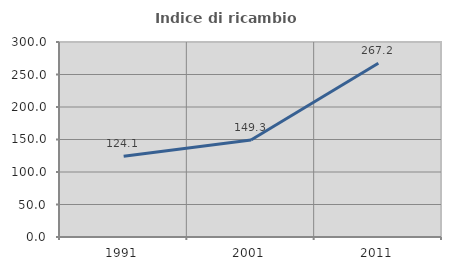
| Category | Indice di ricambio occupazionale  |
|---|---|
| 1991.0 | 124.107 |
| 2001.0 | 149.259 |
| 2011.0 | 267.206 |